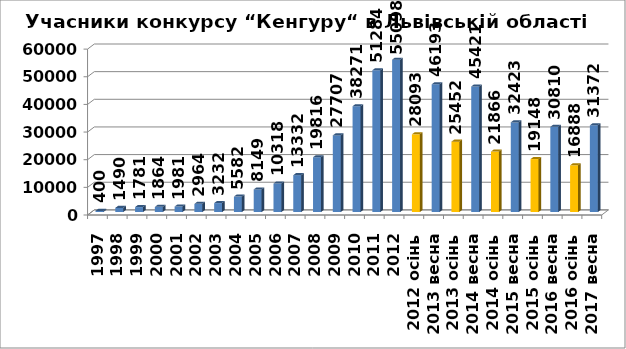
| Category | Львівська |
|---|---|
| 1997 | 400 |
| 1998 | 1490 |
| 1999 | 1781 |
| 2000 | 1864 |
| 2001 | 1981 |
| 2002 | 2964 |
| 2003 | 3232 |
| 2004 | 5582 |
| 2005 | 8149 |
| 2006 | 10318 |
| 2007 | 13332 |
| 2008 | 19816 |
| 2009 | 27707 |
| 2010 | 38271 |
| 2011 | 51284 |
| 2012 | 55098 |
| 2012 осінь | 28093 |
| 2013 весна | 46193 |
| 2013 осінь | 25452 |
| 2014 весна | 45421 |
| 2014 осінь | 21866 |
| 2015 весна | 32423 |
| 2015 осінь | 19148 |
| 2016 весна | 30810 |
| 2016 осінь | 16888 |
| 2017 весна | 31372 |